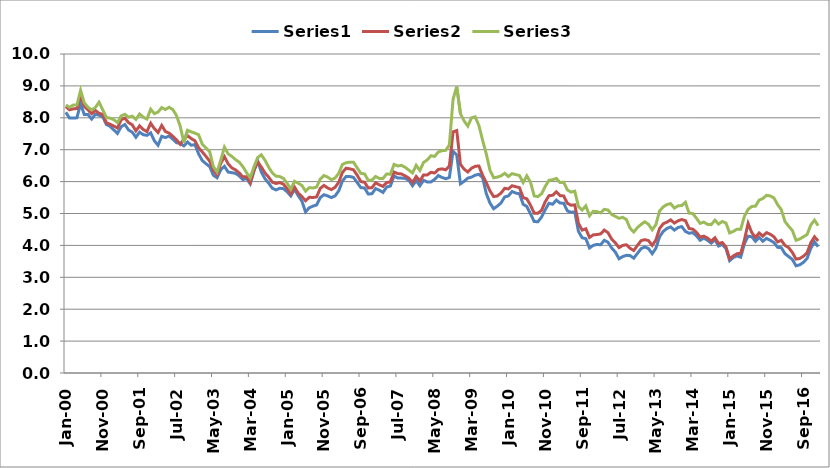
| Category | Series 0 | Series 1 | Series 2 |
|---|---|---|---|
| 2000-01-01 | 8.17 | 8.35 | 8.4 |
| 2000-02-01 | 7.99 | 8.25 | 8.33 |
| 2000-03-01 | 7.99 | 8.28 | 8.4 |
| 2000-04-01 | 8 | 8.29 | 8.4 |
| 2000-05-01 | 8.44 | 8.7 | 8.86 |
| 2000-06-01 | 8.1 | 8.36 | 8.47 |
| 2000-07-01 | 8.1 | 8.25 | 8.33 |
| 2000-08-01 | 7.96 | 8.13 | 8.25 |
| 2000-09-01 | 8.11 | 8.23 | 8.32 |
| 2000-10-01 | 8.08 | 8.14 | 8.49 |
| 2000-11-01 | 8.03 | 8.11 | 8.25 |
| 2000-12-01 | 7.79 | 7.84 | 8.01 |
| 2001-01-01 | 7.73 | 7.8 | 7.99 |
| 2001-02-01 | 7.62 | 7.74 | 7.94 |
| 2001-03-01 | 7.51 | 7.68 | 7.85 |
| 2001-04-01 | 7.72 | 7.94 | 8.06 |
| 2001-05-01 | 7.79 | 7.99 | 8.11 |
| 2001-06-01 | 7.62 | 7.85 | 8.02 |
| 2001-07-01 | 7.55 | 7.78 | 8.05 |
| 2001-08-01 | 7.39 | 7.59 | 7.95 |
| 2001-09-01 | 7.55 | 7.75 | 8.12 |
| 2001-10-01 | 7.47 | 7.63 | 8.02 |
| 2001-11-01 | 7.45 | 7.57 | 7.96 |
| 2001-12-01 | 7.53 | 7.83 | 8.27 |
| 2002-01-01 | 7.28 | 7.66 | 8.13 |
| 2002-02-01 | 7.14 | 7.54 | 8.18 |
| 2002-03-01 | 7.42 | 7.76 | 8.32 |
| 2002-04-01 | 7.38 | 7.57 | 8.26 |
| 2002-05-01 | 7.43 | 7.52 | 8.33 |
| 2002-06-01 | 7.33 | 7.42 | 8.26 |
| 2002-07-01 | 7.22 | 7.31 | 8.07 |
| 2002-08-01 | 7.2 | 7.17 | 7.74 |
| 2002-09-01 | 7.12 | 7.32 | 7.23 |
| 2002-10-01 | 7.24 | 7.44 | 7.61 |
| 2002-11-01 | 7.14 | 7.35 | 7.56 |
| 2002-12-01 | 7.16 | 7.28 | 7.52 |
| 2003-01-01 | 6.87 | 7.06 | 7.47 |
| 2003-02-01 | 6.66 | 6.93 | 7.17 |
| 2003-03-01 | 6.56 | 6.79 | 7.05 |
| 2003-04-01 | 6.47 | 6.64 | 6.94 |
| 2003-05-01 | 6.2 | 6.36 | 6.47 |
| 2003-06-01 | 6.12 | 6.21 | 6.3 |
| 2003-07-01 | 6.37 | 6.57 | 6.67 |
| 2003-08-01 | 6.48 | 6.78 | 7.08 |
| 2003-09-01 | 6.3 | 6.56 | 6.87 |
| 2003-10-01 | 6.28 | 6.43 | 6.79 |
| 2003-11-01 | 6.26 | 6.37 | 6.69 |
| 2003-12-01 | 6.18 | 6.27 | 6.61 |
| 2004-01-01 | 6.06 | 6.15 | 6.47 |
| 2004-02-01 | 6.1 | 6.15 | 6.28 |
| 2004-03-01 | 5.93 | 5.97 | 6.12 |
| 2004-04-01 | 6.33 | 6.35 | 6.46 |
| 2004-05-01 | 6.66 | 6.62 | 6.75 |
| 2004-06-01 | 6.3 | 6.46 | 6.84 |
| 2004-07-01 | 6.09 | 6.27 | 6.67 |
| 2004-08-01 | 5.95 | 6.14 | 6.45 |
| 2004-09-01 | 5.79 | 5.98 | 6.27 |
| 2004-10-01 | 5.74 | 5.94 | 6.17 |
| 2004-11-01 | 5.79 | 5.97 | 6.16 |
| 2004-12-01 | 5.78 | 5.92 | 6.1 |
| 2005-01-01 | 5.68 | 5.78 | 5.95 |
| 2005-02-01 | 5.55 | 5.61 | 5.76 |
| 2005-03-01 | 5.76 | 5.83 | 6.01 |
| 2005-04-01 | 5.56 | 5.64 | 5.95 |
| 2005-05-01 | 5.39 | 5.53 | 5.88 |
| 2005-06-01 | 5.05 | 5.4 | 5.7 |
| 2005-07-01 | 5.18 | 5.51 | 5.81 |
| 2005-08-01 | 5.23 | 5.5 | 5.8 |
| 2005-09-01 | 5.27 | 5.52 | 5.83 |
| 2005-10-01 | 5.5 | 5.79 | 6.08 |
| 2005-11-01 | 5.59 | 5.88 | 6.19 |
| 2005-12-01 | 5.55 | 5.8 | 6.14 |
| 2006-01-01 | 5.5 | 5.75 | 6.06 |
| 2006-02-01 | 5.55 | 5.82 | 6.11 |
| 2006-03-01 | 5.71 | 5.98 | 6.26 |
| 2006-04-01 | 6.02 | 6.29 | 6.54 |
| 2006-05-01 | 6.16 | 6.42 | 6.59 |
| 2006-06-01 | 6.16 | 6.4 | 6.61 |
| 2006-07-01 | 6.13 | 6.37 | 6.61 |
| 2006-08-01 | 5.97 | 6.2 | 6.43 |
| 2006-09-01 | 5.81 | 6 | 6.26 |
| 2006-10-01 | 5.8 | 5.98 | 6.24 |
| 2006-11-01 | 5.61 | 5.8 | 6.04 |
| 2006-12-01 | 5.62 | 5.81 | 6.05 |
| 2007-01-01 | 5.78 | 5.96 | 6.16 |
| 2007-02-01 | 5.73 | 5.9 | 6.1 |
| 2007-03-01 | 5.66 | 5.85 | 6.1 |
| 2007-04-01 | 5.83 | 5.97 | 6.24 |
| 2007-05-01 | 5.86 | 5.99 | 6.23 |
| 2007-06-01 | 6.18 | 6.3 | 6.54 |
| 2007-07-01 | 6.11 | 6.25 | 6.49 |
| 2007-08-01 | 6.11 | 6.24 | 6.51 |
| 2007-09-01 | 6.1 | 6.18 | 6.45 |
| 2007-10-01 | 6.04 | 6.11 | 6.36 |
| 2007-11-01 | 5.87 | 5.97 | 6.27 |
| 2007-12-01 | 6.03 | 6.16 | 6.51 |
| 2008-01-01 | 5.87 | 6.02 | 6.35 |
| 2008-02-01 | 6.04 | 6.21 | 6.6 |
| 2008-03-01 | 5.99 | 6.21 | 6.68 |
| 2008-04-01 | 5.99 | 6.29 | 6.81 |
| 2008-05-01 | 6.07 | 6.27 | 6.79 |
| 2008-06-01 | 6.19 | 6.38 | 6.93 |
| 2008-07-01 | 6.13 | 6.4 | 6.97 |
| 2008-08-01 | 6.09 | 6.37 | 6.98 |
| 2008-09-01 | 6.13 | 6.49 | 7.15 |
| 2008-10-01 | 6.95 | 7.56 | 8.58 |
| 2008-11-01 | 6.83 | 7.6 | 8.98 |
| 2008-12-01 | 5.93 | 6.54 | 8.13 |
| 2009-01-01 | 6.01 | 6.39 | 7.9 |
| 2009-02-01 | 6.11 | 6.3 | 7.74 |
| 2009-03-01 | 6.14 | 6.42 | 8 |
| 2009-04-01 | 6.2 | 6.48 | 8.03 |
| 2009-05-01 | 6.23 | 6.49 | 7.76 |
| 2009-06-01 | 6.13 | 6.2 | 7.3 |
| 2009-07-01 | 5.63 | 5.97 | 6.87 |
| 2009-08-01 | 5.33 | 5.71 | 6.36 |
| 2009-09-01 | 5.15 | 5.53 | 6.12 |
| 2009-10-01 | 5.23 | 5.55 | 6.14 |
| 2009-11-01 | 5.33 | 5.64 | 6.18 |
| 2009-12-01 | 5.52 | 5.79 | 6.26 |
| 2010-01-01 | 5.55 | 5.77 | 6.16 |
| 2010-02-01 | 5.69 | 5.87 | 6.25 |
| 2010-03-01 | 5.64 | 5.84 | 6.22 |
| 2010-04-01 | 5.62 | 5.81 | 6.19 |
| 2010-05-01 | 5.29 | 5.5 | 5.97 |
| 2010-06-01 | 5.22 | 5.46 | 6.18 |
| 2010-07-01 | 4.99 | 5.26 | 5.98 |
| 2010-08-01 | 4.75 | 5.01 | 5.55 |
| 2010-09-01 | 4.74 | 5.01 | 5.53 |
| 2010-10-01 | 4.89 | 5.1 | 5.62 |
| 2010-11-01 | 5.12 | 5.37 | 5.85 |
| 2010-12-01 | 5.32 | 5.56 | 6.04 |
| 2011-01-01 | 5.29 | 5.57 | 6.06 |
| 2011-02-01 | 5.42 | 5.68 | 6.1 |
| 2011-03-01 | 5.33 | 5.56 | 5.97 |
| 2011-04-01 | 5.32 | 5.55 | 5.98 |
| 2011-05-01 | 5.08 | 5.32 | 5.74 |
| 2011-06-01 | 5.04 | 5.26 | 5.67 |
| 2011-07-01 | 5.05 | 5.27 | 5.7 |
| 2011-08-01 | 4.44 | 4.69 | 5.22 |
| 2011-09-01 | 4.24 | 4.48 | 5.11 |
| 2011-10-01 | 4.21 | 4.52 | 5.24 |
| 2011-11-01 | 3.92 | 4.25 | 4.93 |
| 2011-12-01 | 4 | 4.33 | 5.07 |
| 2012-01-01 | 4.03 | 4.34 | 5.06 |
| 2012-02-01 | 4.02 | 4.36 | 5.02 |
| 2012-03-01 | 4.16 | 4.48 | 5.13 |
| 2012-04-01 | 4.1 | 4.4 | 5.11 |
| 2012-05-01 | 3.92 | 4.2 | 4.97 |
| 2012-06-01 | 3.79 | 4.08 | 4.91 |
| 2012-07-01 | 3.58 | 3.93 | 4.85 |
| 2012-08-01 | 3.65 | 4 | 4.88 |
| 2012-09-01 | 3.69 | 4.02 | 4.81 |
| 2012-10-01 | 3.68 | 3.91 | 4.54 |
| 2012-11-01 | 3.6 | 3.84 | 4.42 |
| 2012-12-01 | 3.75 | 4 | 4.56 |
| 2013-01-01 | 3.9 | 4.15 | 4.66 |
| 2013-02-01 | 3.95 | 4.18 | 4.74 |
| 2013-03-01 | 3.9 | 4.15 | 4.66 |
| 2013-04-01 | 3.74 | 4 | 4.49 |
| 2013-05-01 | 3.91 | 4.17 | 4.65 |
| 2013-06-01 | 4.27 | 4.53 | 5.08 |
| 2013-07-01 | 4.44 | 4.68 | 5.21 |
| 2013-08-01 | 4.53 | 4.73 | 5.28 |
| 2013-09-01 | 4.58 | 4.8 | 5.31 |
| 2013-10-01 | 4.48 | 4.7 | 5.17 |
| 2013-11-01 | 4.56 | 4.77 | 5.24 |
| 2013-12-01 | 4.59 | 4.81 | 5.25 |
| 2014-01-01 | 4.44 | 4.778 | 5.351 |
| 2014-02-01 | 4.38 | 4.53 | 5.01 |
| 2014-03-01 | 4.4 | 4.51 | 5 |
| 2014-04-01 | 4.3 | 4.41 | 4.85 |
| 2014-05-01 | 4.16 | 4.26 | 4.69 |
| 2014-06-01 | 4.23 | 4.29 | 4.73 |
| 2014-07-01 | 4.16 | 4.23 | 4.66 |
| 2014-08-01 | 4.07 | 4.13 | 4.65 |
| 2014-09-01 | 4.18 | 4.24 | 4.79 |
| 2014-10-01 | 3.98 | 4.06 | 4.67 |
| 2014-11-01 | 4.03 | 4.09 | 4.75 |
| 2014-12-01 | 3.9 | 3.95 | 4.7 |
| 2015-01-01 | 3.52 | 3.58 | 4.39 |
| 2015-02-01 | 3.62 | 3.67 | 4.44 |
| 2015-03-01 | 3.67 | 3.74 | 4.51 |
| 2015-04-01 | 3.63 | 3.75 | 4.51 |
| 2015-05-01 | 4.05 | 4.17 | 4.91 |
| 2015-06-01 | 4.29 | 4.69 | 5.13 |
| 2015-07-01 | 4.27 | 4.4 | 5.22 |
| 2015-08-01 | 4.13 | 4.25 | 5.23 |
| 2015-09-01 | 4.25 | 4.39 | 5.42 |
| 2015-10-01 | 4.13 | 4.29 | 5.47 |
| 2015-11-01 | 4.22 | 4.4 | 5.57 |
| 2015-12-01 | 4.16 | 4.35 | 5.55 |
| 2016-01-01 | 4.09 | 4.27 | 5.49 |
| 2016-02-01 | 3.94 | 4.11 | 5.28 |
| 2016-03-01 | 3.93 | 4.16 | 5.12 |
| 2016-04-01 | 3.74 | 4 | 4.75 |
| 2016-05-01 | 3.65 | 3.93 | 4.6 |
| 2016-06-01 | 3.56 | 3.78 | 4.47 |
| 2016-07-01 | 3.36 | 3.57 | 4.16 |
| 2016-08-01 | 3.39 | 3.59 | 4.2 |
| 2016-09-01 | 3.47 | 3.66 | 4.27 |
| 2016-10-01 | 3.59 | 3.77 | 4.34 |
| 2016-11-01 | 3.91 | 4.08 | 4.64 |
| 2016-12-01 | 4.11 | 4.27 | 4.79 |
| 2017-01-01 | 3.96 | 4.14 | 4.62 |